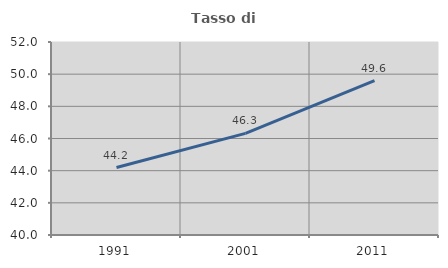
| Category | Tasso di occupazione   |
|---|---|
| 1991.0 | 44.193 |
| 2001.0 | 46.322 |
| 2011.0 | 49.593 |